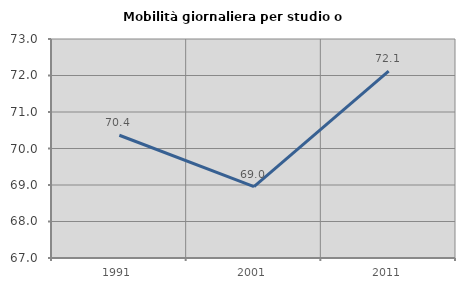
| Category | Mobilità giornaliera per studio o lavoro |
|---|---|
| 1991.0 | 70.364 |
| 2001.0 | 68.956 |
| 2011.0 | 72.121 |